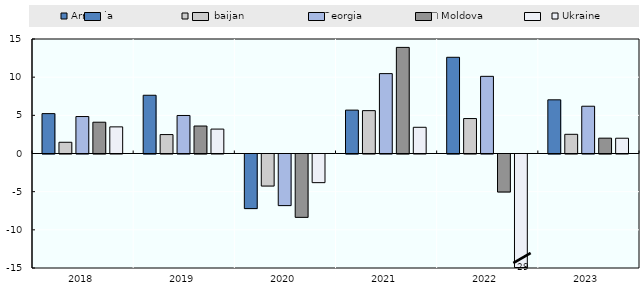
| Category | Armenia | Azerbaijan | Georgia | Moldova | Ukraine |
|---|---|---|---|---|---|
| 2018.0 | 5.225 | 1.47 | 4.843 | 4.1 | 3.488 |
| 2019.0 | 7.631 | 2.48 | 4.982 | 3.6 | 3.199 |
| 2020.0 | -7.151 | -4.199 | -6.76 | -8.3 | -3.753 |
| 2021.0 | 5.684 | 5.616 | 10.466 | 13.9 | 3.433 |
| 2022.0 | 12.604 | 4.577 | 10.109 | -4.979 | -29.069 |
| 2023.0 | 7.032 | 2.514 | 6.193 | 2.009 | 2 |